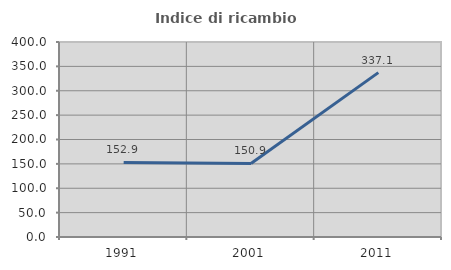
| Category | Indice di ricambio occupazionale  |
|---|---|
| 1991.0 | 152.941 |
| 2001.0 | 150.909 |
| 2011.0 | 337.143 |